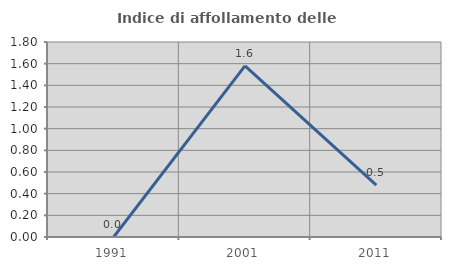
| Category | Indice di affollamento delle abitazioni  |
|---|---|
| 1991.0 | 0 |
| 2001.0 | 1.579 |
| 2011.0 | 0.478 |